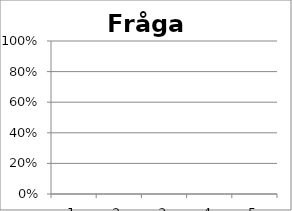
| Category | Fråga 1 |
|---|---|
| 0 | 0 |
| 1 | 0 |
| 2 | 0 |
| 3 | 0 |
| 4 | 0 |